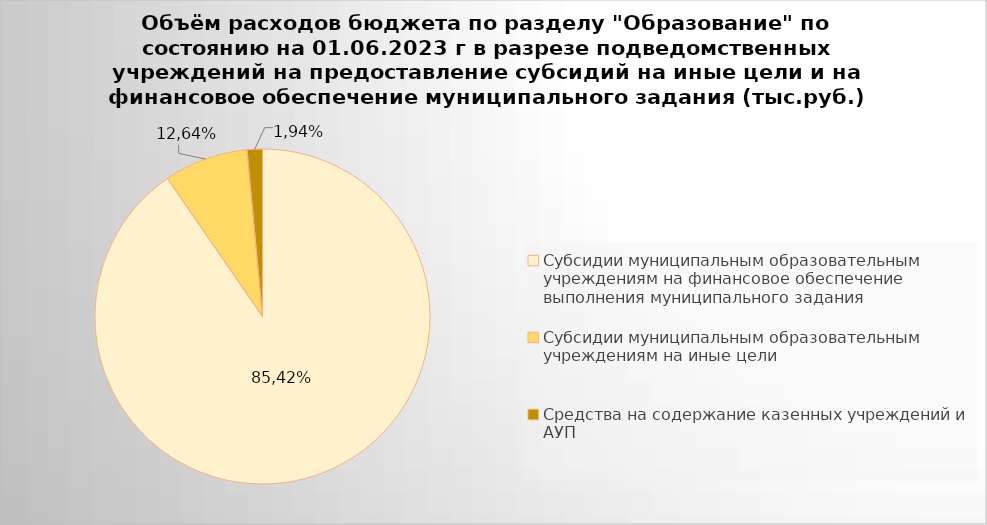
| Category | Series 0 |
|---|---|
| Субсидии муниципальным образовательным учреждениям на финансовое обеспечение выполнения муниципального задания | 7946233.4 |
| Субсидии муниципальным образовательным учреждениям на иные цели | 714212.13 |
| Средства на содержание казенных учреждений и АУП | 129747.54 |